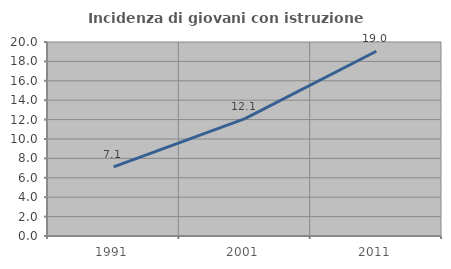
| Category | Incidenza di giovani con istruzione universitaria |
|---|---|
| 1991.0 | 7.128 |
| 2001.0 | 12.095 |
| 2011.0 | 19.048 |